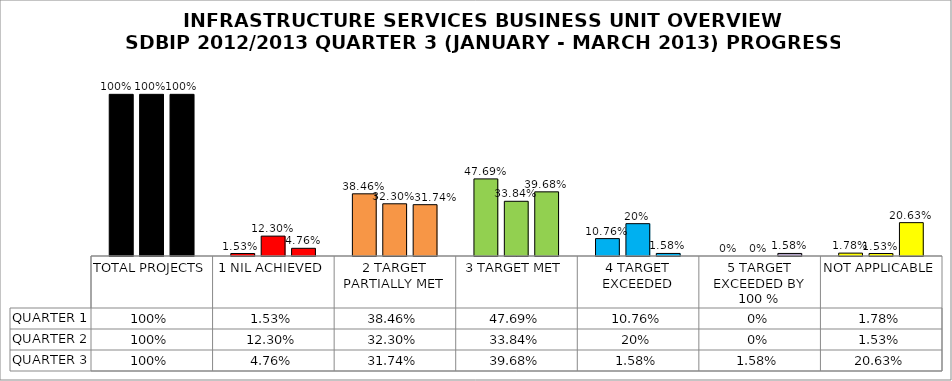
| Category | QUARTER 1 | QUARTER 2 | QUARTER 3 |
|---|---|---|---|
| TOTAL PROJECTS | 1 | 1 | 1 |
| 1 NIL ACHIEVED | 0.015 | 0.123 | 0.048 |
| 2 TARGET PARTIALLY MET | 0.385 | 0.323 | 0.317 |
| 3 TARGET MET | 0.477 | 0.338 | 0.397 |
| 4 TARGET EXCEEDED | 0.108 | 0.2 | 0.016 |
| 5 TARGET EXCEEDED BY 100 % | 0 | 0 | 0.016 |
| NOT APPLICABLE | 0.018 | 0.015 | 0.206 |